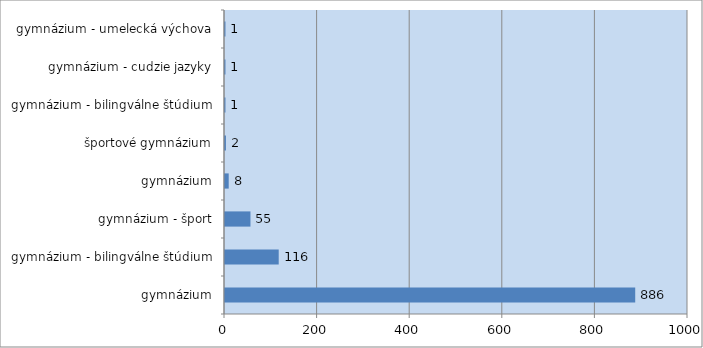
| Category | Series 0 |
|---|---|
| gymnázium | 886 |
| gymnázium - bilingválne štúdium | 116 |
| gymnázium - šport | 55 |
| gymnázium | 8 |
| športové gymnázium | 2 |
| gymnázium - bilingválne štúdium | 1 |
| gymnázium - cudzie jazyky | 1 |
| gymnázium - umelecká výchova | 1 |